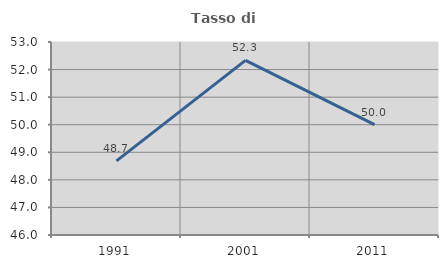
| Category | Tasso di occupazione   |
|---|---|
| 1991.0 | 48.687 |
| 2001.0 | 52.332 |
| 2011.0 | 50 |